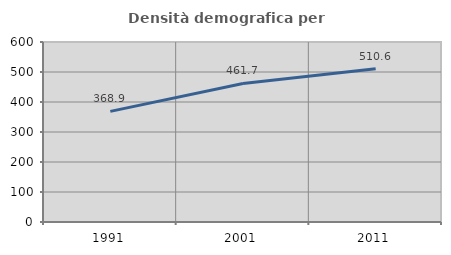
| Category | Densità demografica |
|---|---|
| 1991.0 | 368.852 |
| 2001.0 | 461.688 |
| 2011.0 | 510.597 |